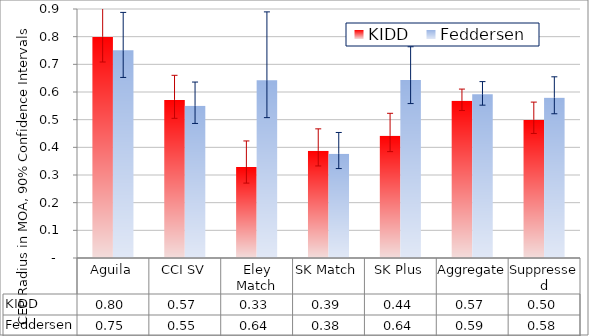
| Category | KIDD | Feddersen |
|---|---|---|
| Aguila | 0.801 | 0.751 |
| CCI SV | 0.571 | 0.55 |
| Eley Match | 0.329 | 0.643 |
| SK Match | 0.388 | 0.377 |
| SK Plus | 0.442 | 0.644 |
| Aggregate | 0.569 | 0.592 |
| Suppressed | 0.5 | 0.58 |